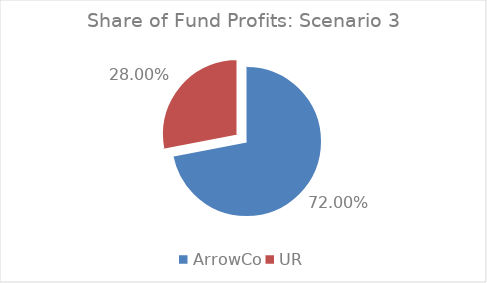
| Category | Series 0 |
|---|---|
| ArrowCo | 0.72 |
| UR | 0.28 |